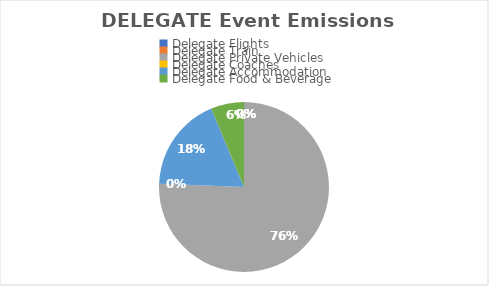
| Category | Series 0 |
|---|---|
| Delegate Flights | 0 |
| Delegate Train | 0 |
| Delegate Private Vehicles | 0.96 |
| Delegate Coaches | 0 |
| Delegate Accommodation | 0.23 |
| Delegate Food & Beverage | 0.08 |